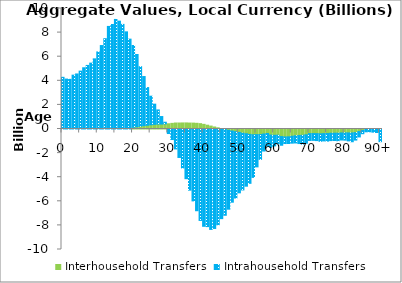
| Category | Interhousehold Transfers | Intrahousehold Transfers |
|---|---|---|
| 0 | 0 | 4289.608 |
|  | 0 | 4144.176 |
| 2 | 0 | 4119.979 |
| 3 | 0 | 4468.515 |
| 4 | 0 | 4567.77 |
| 5 | 0 | 4802.95 |
| 6 | 0 | 5081.429 |
| 7 | 0 | 5277.298 |
| 8 | 0 | 5466.852 |
| 9 | 0 | 5820.726 |
| 10 | 0 | 6396.919 |
| 11 | 0 | 6925.226 |
| 12 | 0 | 7494.681 |
| 13 | 0 | 8512.666 |
| 14 | 0 | 8674.649 |
| 15 | 0 | 9091.713 |
| 16 | 0 | 8949.273 |
| 17 | 0 | 8681.712 |
| 18 | 0 | 8061.112 |
| 19 | 0 | 7456.912 |
| 20 | 144.689 | 6785.483 |
| 21 | 184.285 | 5998.887 |
| 22 | 227.346 | 4940.628 |
| 23 | 279.009 | 4075.2 |
| 24 | 311.648 | 3127.252 |
| 25 | 351.306 | 2370.57 |
| 26 | 385.029 | 1676.274 |
| 27 | 407.067 | 1176.65 |
| 28 | 409.864 | 623.896 |
| 29 | 428.69 | 133.146 |
| 30 | 433.652 | -376.19 |
| 31 | 467.986 | -875.589 |
| 32 | 496.589 | -1655.617 |
| 33 | 496.906 | -2362.439 |
| 34 | 502.41 | -3229.79 |
| 35 | 503.818 | -4123.421 |
| 36 | 492.586 | -5075.965 |
| 37 | 489.025 | -5965.999 |
| 38 | 472.517 | -6782.738 |
| 39 | 443.495 | -7589.044 |
| 40 | 385.527 | -8074.92 |
| 41 | 314.671 | -8100.272 |
| 42 | 241.669 | -8333.222 |
| 43 | 167.008 | -8253.832 |
| 44 | 96.941 | -7947.941 |
| 45 | 27.446 | -7438.67 |
| 46 | -44.023 | -7116.404 |
| 47 | -108.215 | -6546.43 |
| 48 | -169.578 | -5904.976 |
| 49 | -227.752 | -5500.217 |
| 50 | -282.511 | -5015.637 |
| 51 | -343.54 | -4713.675 |
| 52 | -393.246 | -4353.067 |
| 53 | -448.822 | -4060.51 |
| 54 | -477.442 | -3538.531 |
| 55 | -469.633 | -2673.227 |
| 56 | -460.632 | -2055.829 |
| 57 | -414.831 | -1413.466 |
| 58 | -375.547 | -1049.783 |
| 59 | -506.978 | -1025.786 |
| 60 | -523.548 | -876.169 |
| 61 | -514.557 | -694.337 |
| 62 | -626.237 | -722.216 |
| 63 | -660.851 | -547.701 |
| 64 | -647.57 | -556.82 |
| 65 | -600.805 | -574.37 |
| 66 | -561.76 | -597.309 |
| 67 | -545.043 | -663.035 |
| 68 | -522.616 | -732.868 |
| 69 | -481.594 | -697.912 |
| 70 | -385.97 | -562.515 |
| 71 | -381.132 | -561.672 |
| 72 | -384.398 | -577.062 |
| 73 | -401.783 | -618.281 |
| 74 | -385.439 | -602.475 |
| 75 | -377.733 | -627.829 |
| 76 | -352.202 | -610.049 |
| 77 | -348.39 | -608.052 |
| 78 | -347.905 | -627.728 |
| 79 | -326.619 | -587.228 |
| 80 | -320.533 | -604.686 |
| 81 | -326.317 | -660.838 |
| 82 | -326.604 | -731.068 |
| 83 | -301.372 | -618.584 |
| 84 | -211.479 | -448.079 |
| 85 | -125.972 | -265.203 |
| 86 | 0 | -232.605 |
| 87 | 0 | -229.043 |
| 88 | 0 | -261.279 |
| 89 | 0 | -290.027 |
| 90+ | 0 | -1051.925 |